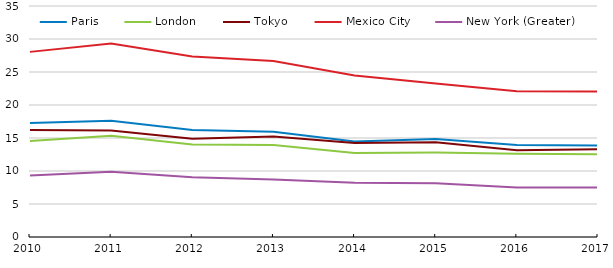
| Category | Paris | London | Tokyo | Mexico City | New York (Greater) |
|---|---|---|---|---|---|
| 2010.0 | 17.27 | 14.55 | 16.22 | 28.05 | 9.31 |
| 2011.0 | 17.62 | 15.34 | 16.15 | 29.3 | 9.89 |
| 2012.0 | 16.22 | 14 | 14.88 | 27.34 | 9.06 |
| 2013.0 | 15.94 | 13.93 | 15.22 | 26.66 | 8.73 |
| 2014.0 | 14.46 | 12.74 | 14.23 | 24.46 | 8.22 |
| 2015.0 | 14.84 | 12.8 | 14.37 | 23.26 | 8.13 |
| 2016.0 | 13.94 | 12.61 | 13.14 | 22.07 | 7.51 |
| 2017.0 | 13.87 | 12.52 | 13.29 | 22.05 | 7.49 |